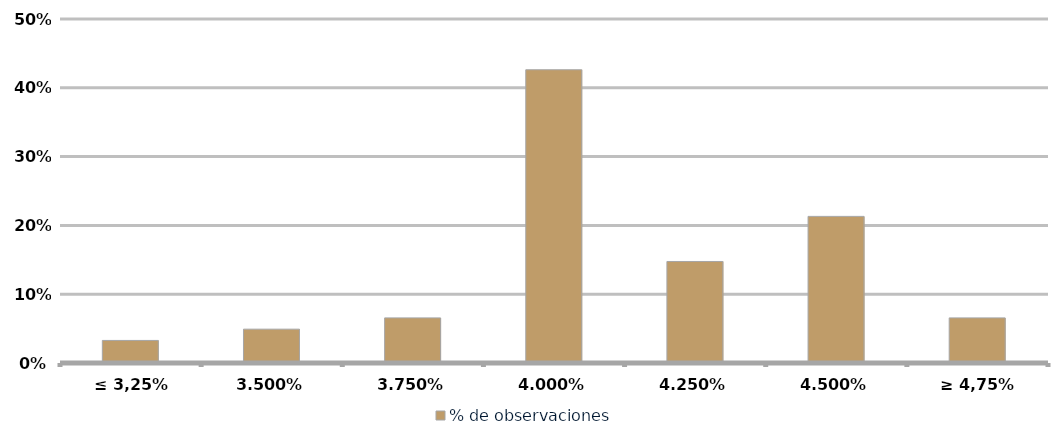
| Category | % de observaciones  |
|---|---|
| ≤ 3,25% | 0.033 |
| 3.50% | 0.049 |
| 3.75% | 0.066 |
| 4.00% | 0.426 |
| 4.25% | 0.148 |
| 4.50% | 0.213 |
| ≥ 4,75% | 0.066 |